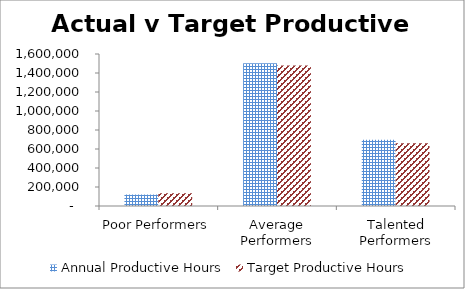
| Category | Annual Productive Hours | Target Productive Hours |
|---|---|---|
| Poor Performers | 121200 | 133320 |
| Average Performers | 1502880 | 1478640 |
| Talented Performers | 698112 | 659328 |